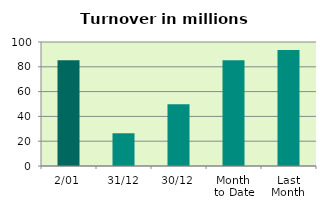
| Category | Series 0 |
|---|---|
| 2/01 | 85.211 |
| 31/12 | 26.399 |
| 30/12 | 49.85 |
| Month 
to Date | 85.211 |
| Last
Month | 93.592 |